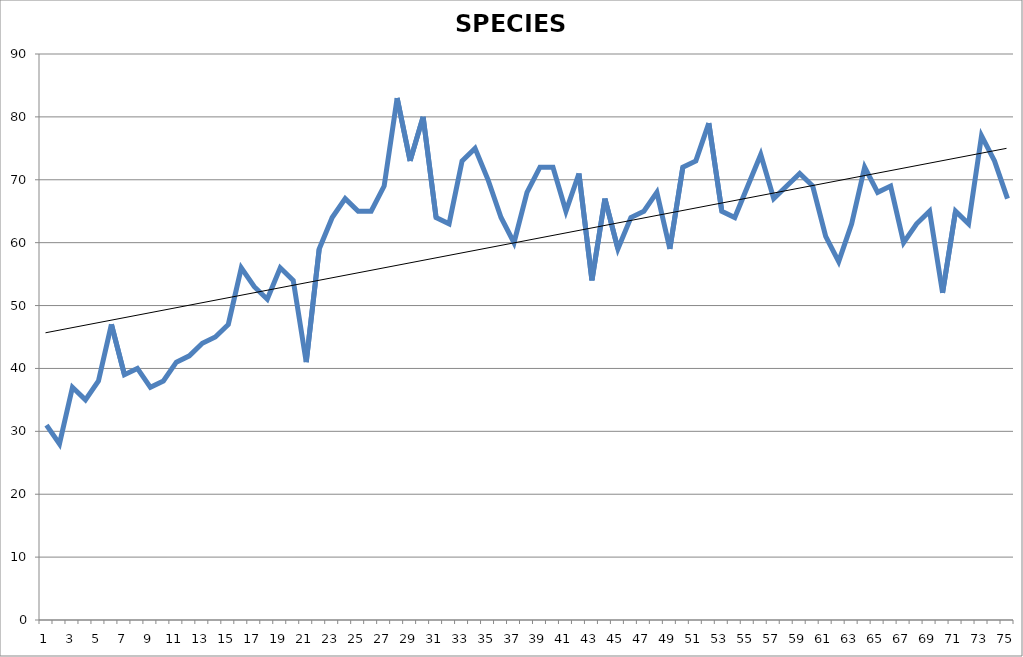
| Category | SPECIES 1948-2022 |
|---|---|
| 0 | 31 |
| 1 | 28 |
| 2 | 37 |
| 3 | 35 |
| 4 | 38 |
| 5 | 47 |
| 6 | 39 |
| 7 | 40 |
| 8 | 37 |
| 9 | 38 |
| 10 | 41 |
| 11 | 42 |
| 12 | 44 |
| 13 | 45 |
| 14 | 47 |
| 15 | 56 |
| 16 | 53 |
| 17 | 51 |
| 18 | 56 |
| 19 | 54 |
| 20 | 41 |
| 21 | 59 |
| 22 | 64 |
| 23 | 67 |
| 24 | 65 |
| 25 | 65 |
| 26 | 69 |
| 27 | 83 |
| 28 | 73 |
| 29 | 80 |
| 30 | 64 |
| 31 | 63 |
| 32 | 73 |
| 33 | 75 |
| 34 | 70 |
| 35 | 64 |
| 36 | 60 |
| 37 | 68 |
| 38 | 72 |
| 39 | 72 |
| 40 | 65 |
| 41 | 71 |
| 42 | 54 |
| 43 | 67 |
| 44 | 59 |
| 45 | 64 |
| 46 | 65 |
| 47 | 68 |
| 48 | 59 |
| 49 | 72 |
| 50 | 73 |
| 51 | 79 |
| 52 | 65 |
| 53 | 64 |
| 54 | 69 |
| 55 | 74 |
| 56 | 67 |
| 57 | 69 |
| 58 | 71 |
| 59 | 69 |
| 60 | 61 |
| 61 | 57 |
| 62 | 63 |
| 63 | 72 |
| 64 | 68 |
| 65 | 69 |
| 66 | 60 |
| 67 | 63 |
| 68 | 65 |
| 69 | 52 |
| 70 | 65 |
| 71 | 63 |
| 72 | 77 |
| 73 | 73 |
| 74 | 67 |